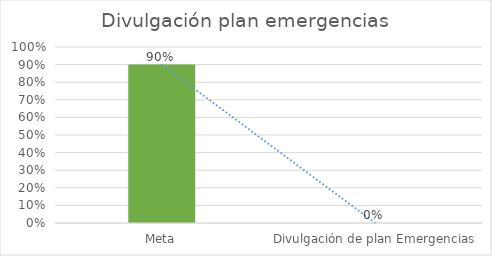
| Category | Series 0 |
|---|---|
| Meta | 0.9 |
| Divulgación de plan Emergencias | 0 |